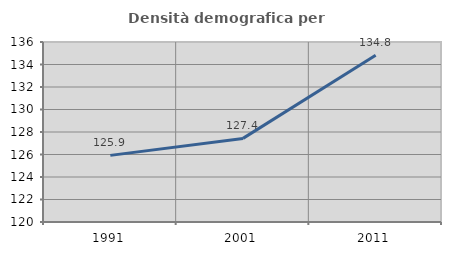
| Category | Densità demografica |
|---|---|
| 1991.0 | 125.923 |
| 2001.0 | 127.432 |
| 2011.0 | 134.83 |